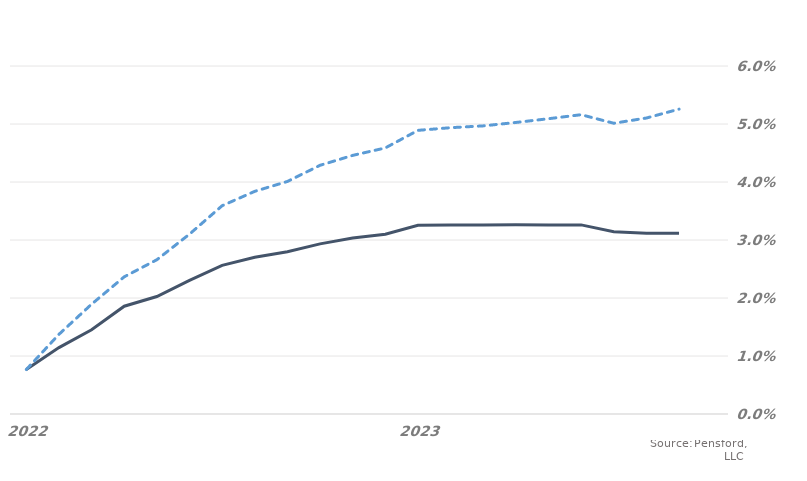
| Category | MARKET EXPECTATIONS | +1 Standard Deviation |
|---|---|---|
| 2022-04-29 | 0.008 | 0.008 |
| 2022-05-29 | 0.011 | 0.014 |
| 2022-06-29 | 0.015 | 0.019 |
| 2022-07-29 | 0.019 | 0.024 |
| 2022-08-29 | 0.02 | 0.027 |
| 2022-09-29 | 0.023 | 0.031 |
| 2022-10-29 | 0.026 | 0.036 |
| 2022-11-29 | 0.027 | 0.038 |
| 2022-12-29 | 0.028 | 0.04 |
| 2023-01-29 | 0.029 | 0.043 |
| 2023-02-28 | 0.03 | 0.045 |
| 2023-03-28 | 0.031 | 0.046 |
| 2023-04-28 | 0.033 | 0.049 |
| 2023-05-28 | 0.033 | 0.049 |
| 2023-06-28 | 0.033 | 0.05 |
| 2023-07-28 | 0.033 | 0.05 |
| 2023-08-28 | 0.033 | 0.051 |
| 2023-09-28 | 0.033 | 0.052 |
| 2023-10-28 | 0.031 | 0.05 |
| 2023-11-28 | 0.031 | 0.051 |
| 2023-12-28 | 0.031 | 0.053 |
| 2024-01-28 | 0.031 | 0.053 |
| 2024-02-28 | 0.031 | 0.054 |
| 2024-03-28 | 0.031 | 0.054 |
| 2024-04-28 | 0.029 | 0.051 |
| 2024-05-28 | 0.029 | 0.051 |
| 2024-06-28 | 0.029 | 0.051 |
| 2024-07-28 | 0.029 | 0.052 |
| 2024-08-28 | 0.029 | 0.052 |
| 2024-09-28 | 0.029 | 0.053 |
| 2024-10-28 | 0.029 | 0.053 |
| 2024-11-28 | 0.029 | 0.054 |
| 2024-12-28 | 0.029 | 0.054 |
| 2025-01-28 | 0.029 | 0.055 |
| 2025-02-28 | 0.029 | 0.054 |
| 2025-03-28 | 0.029 | 0.054 |
| 2025-04-28 | 0.027 | 0.051 |
| 2025-05-28 | 0.026 | 0.051 |
| 2025-06-28 | 0.026 | 0.051 |
| 2025-07-28 | 0.026 | 0.051 |
| 2025-08-28 | 0.026 | 0.052 |
| 2025-09-28 | 0.026 | 0.052 |
| 2025-10-28 | 0.026 | 0.052 |
| 2025-11-28 | 0.026 | 0.053 |
| 2025-12-28 | 0.026 | 0.053 |
| 2026-01-28 | 0.026 | 0.053 |
| 2026-02-28 | 0.026 | 0.053 |
| 2026-03-28 | 0.026 | 0.053 |
| 2026-04-28 | 0.026 | 0.052 |
| 2026-05-28 | 0.026 | 0.052 |
| 2026-06-28 | 0.026 | 0.052 |
| 2026-07-28 | 0.026 | 0.052 |
| 2026-08-28 | 0.026 | 0.052 |
| 2026-09-28 | 0.026 | 0.053 |
| 2026-10-28 | 0.026 | 0.053 |
| 2026-11-28 | 0.026 | 0.053 |
| 2026-12-28 | 0.026 | 0.054 |
| 2027-01-28 | 0.026 | 0.054 |
| 2027-02-28 | 0.026 | 0.053 |
| 2027-03-28 | 0.026 | 0.053 |
| 2027-04-28 | 0.026 | 0.052 |
| 2027-05-28 | 0.026 | 0.053 |
| 2027-06-28 | 0.026 | 0.053 |
| 2027-07-28 | 0.026 | 0.053 |
| 2027-08-28 | 0.026 | 0.053 |
| 2027-09-28 | 0.026 | 0.054 |
| 2027-10-28 | 0.026 | 0.054 |
| 2027-11-28 | 0.026 | 0.054 |
| 2027-12-28 | 0.026 | 0.054 |
| 2028-01-28 | 0.026 | 0.054 |
| 2028-02-28 | 0.026 | 0.054 |
| 2028-03-28 | 0.026 | 0.053 |
| 2028-04-28 | 0.026 | 0.053 |
| 2028-05-28 | 0.026 | 0.053 |
| 2028-06-28 | 0.026 | 0.053 |
| 2028-07-28 | 0.026 | 0.054 |
| 2028-08-28 | 0.026 | 0.054 |
| 2028-09-28 | 0.026 | 0.054 |
| 2028-10-28 | 0.026 | 0.054 |
| 2028-11-28 | 0.026 | 0.054 |
| 2028-12-28 | 0.026 | 0.055 |
| 2029-01-28 | 0.026 | 0.055 |
| 2029-02-28 | 0.026 | 0.054 |
| 2029-03-28 | 0.026 | 0.054 |
| 2029-04-28 | 0.026 | 0.053 |
| 2029-05-28 | 0.026 | 0.053 |
| 2029-06-28 | 0.026 | 0.053 |
| 2029-07-28 | 0.026 | 0.053 |
| 2029-08-28 | 0.026 | 0.054 |
| 2029-09-28 | 0.026 | 0.054 |
| 2029-10-28 | 0.026 | 0.054 |
| 2029-11-28 | 0.026 | 0.054 |
| 2029-12-28 | 0.026 | 0.054 |
| 2030-01-28 | 0.026 | 0.054 |
| 2030-02-28 | 0.026 | 0.054 |
| 2030-03-28 | 0.026 | 0.054 |
| 2030-04-28 | 0.026 | 0.054 |
| 2030-05-28 | 0.026 | 0.054 |
| 2030-06-28 | 0.026 | 0.054 |
| 2030-07-28 | 0.026 | 0.054 |
| 2030-08-28 | 0.026 | 0.055 |
| 2030-09-28 | 0.026 | 0.055 |
| 2030-10-28 | 0.026 | 0.055 |
| 2030-11-28 | 0.026 | 0.055 |
| 2030-12-28 | 0.026 | 0.055 |
| 2031-01-28 | 0.026 | 0.055 |
| 2031-02-28 | 0.026 | 0.055 |
| 2031-03-28 | 0.026 | 0.055 |
| 2031-04-28 | 0.027 | 0.055 |
| 2031-05-28 | 0.027 | 0.055 |
| 2031-06-28 | 0.027 | 0.055 |
| 2031-07-28 | 0.027 | 0.055 |
| 2031-08-28 | 0.027 | 0.055 |
| 2031-09-28 | 0.027 | 0.056 |
| 2031-10-28 | 0.027 | 0.056 |
| 2031-11-28 | 0.027 | 0.056 |
| 2031-12-28 | 0.027 | 0.056 |
| 2032-01-28 | 0.027 | 0.056 |
| 2032-02-28 | 0.027 | 0.056 |
| 2032-03-28 | 0.027 | 0.055 |